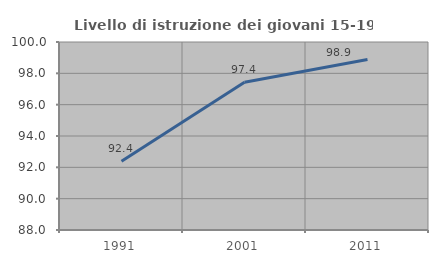
| Category | Livello di istruzione dei giovani 15-19 anni |
|---|---|
| 1991.0 | 92.391 |
| 2001.0 | 97.436 |
| 2011.0 | 98.889 |